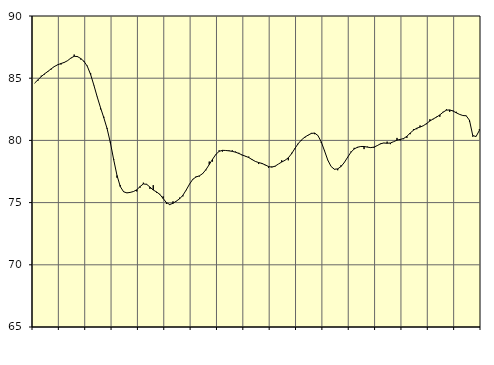
| Category | Piggar | Series 1 |
|---|---|---|
| nan | 84.6 | 84.61 |
| 87.0 | 84.8 | 84.87 |
| 87.0 | 85.2 | 85.13 |
| 87.0 | 85.3 | 85.35 |
| nan | 85.5 | 85.54 |
| 88.0 | 85.7 | 85.75 |
| 88.0 | 85.9 | 85.94 |
| 88.0 | 86.1 | 86.08 |
| nan | 86.1 | 86.18 |
| 89.0 | 86.3 | 86.27 |
| 89.0 | 86.4 | 86.41 |
| 89.0 | 86.6 | 86.62 |
| nan | 86.9 | 86.76 |
| 90.0 | 86.7 | 86.74 |
| 90.0 | 86.5 | 86.58 |
| 90.0 | 86.3 | 86.35 |
| nan | 86 | 85.95 |
| 91.0 | 85.4 | 85.29 |
| 91.0 | 84.4 | 84.42 |
| 91.0 | 83.5 | 83.49 |
| nan | 82.5 | 82.63 |
| 92.0 | 81.9 | 81.82 |
| 92.0 | 81 | 80.94 |
| 92.0 | 79.9 | 79.8 |
| nan | 78.5 | 78.44 |
| 93.0 | 77 | 77.18 |
| 93.0 | 76.4 | 76.29 |
| 93.0 | 75.9 | 75.87 |
| nan | 75.8 | 75.78 |
| 94.0 | 75.8 | 75.82 |
| 94.0 | 75.9 | 75.89 |
| 94.0 | 75.9 | 76.03 |
| nan | 76.2 | 76.29 |
| 95.0 | 76.6 | 76.5 |
| 95.0 | 76.5 | 76.47 |
| 95.0 | 76.1 | 76.25 |
| nan | 76.4 | 76.01 |
| 96.0 | 75.8 | 75.86 |
| 96.0 | 75.7 | 75.66 |
| 96.0 | 75.5 | 75.33 |
| nan | 74.9 | 75 |
| 97.0 | 74.8 | 74.85 |
| 97.0 | 75.1 | 74.94 |
| 97.0 | 75.1 | 75.12 |
| nan | 75.4 | 75.3 |
| 98.0 | 75.5 | 75.59 |
| 98.0 | 76 | 76.01 |
| 98.0 | 76.5 | 76.48 |
| nan | 76.9 | 76.87 |
| 99.0 | 77.1 | 77.06 |
| 99.0 | 77.1 | 77.15 |
| 99.0 | 77.3 | 77.33 |
| nan | 77.6 | 77.65 |
| 0.0 | 78.3 | 78.06 |
| 0.0 | 78.3 | 78.48 |
| 0.0 | 78.9 | 78.87 |
| nan | 79.2 | 79.12 |
| 1.0 | 79.1 | 79.2 |
| 1.0 | 79.2 | 79.19 |
| 1.0 | 79.2 | 79.16 |
| nan | 79.2 | 79.12 |
| 2.0 | 79.1 | 79.05 |
| 2.0 | 79 | 78.95 |
| 2.0 | 78.8 | 78.83 |
| nan | 78.7 | 78.73 |
| 3.0 | 78.7 | 78.62 |
| 3.0 | 78.5 | 78.46 |
| 3.0 | 78.3 | 78.31 |
| nan | 78.1 | 78.22 |
| 4.0 | 78.1 | 78.15 |
| 4.0 | 78 | 78.03 |
| 4.0 | 77.8 | 77.9 |
| nan | 77.9 | 77.85 |
| 5.0 | 77.9 | 77.93 |
| 5.0 | 78.1 | 78.1 |
| 5.0 | 78.4 | 78.26 |
| nan | 78.4 | 78.4 |
| 6.0 | 78.4 | 78.6 |
| 6.0 | 79 | 78.93 |
| 6.0 | 79.3 | 79.35 |
| nan | 79.7 | 79.74 |
| 7.0 | 80 | 80.04 |
| 7.0 | 80.2 | 80.26 |
| 7.0 | 80.4 | 80.42 |
| nan | 80.6 | 80.56 |
| 8.0 | 80.5 | 80.59 |
| 8.0 | 80.4 | 80.39 |
| 8.0 | 79.8 | 79.88 |
| nan | 79.2 | 79.16 |
| 9.0 | 78.4 | 78.41 |
| 9.0 | 77.9 | 77.9 |
| 9.0 | 77.7 | 77.68 |
| nan | 77.6 | 77.71 |
| 10.0 | 78 | 77.9 |
| 10.0 | 78.2 | 78.22 |
| 10.0 | 78.6 | 78.64 |
| nan | 79.1 | 79.04 |
| 11.0 | 79.4 | 79.31 |
| 11.0 | 79.4 | 79.45 |
| 11.0 | 79.5 | 79.51 |
| nan | 79.3 | 79.51 |
| 12.0 | 79.5 | 79.46 |
| 12.0 | 79.4 | 79.42 |
| 12.0 | 79.4 | 79.46 |
| nan | 79.6 | 79.58 |
| 13.0 | 79.7 | 79.73 |
| 13.0 | 79.8 | 79.79 |
| 13.0 | 79.9 | 79.77 |
| nan | 79.7 | 79.79 |
| 14.0 | 79.9 | 79.9 |
| 14.0 | 80.2 | 80.02 |
| 14.0 | 80 | 80.08 |
| nan | 80.1 | 80.15 |
| 15.0 | 80.2 | 80.33 |
| 15.0 | 80.5 | 80.59 |
| 15.0 | 80.9 | 80.82 |
| nan | 80.9 | 80.98 |
| 16.0 | 81.2 | 81.07 |
| 16.0 | 81.2 | 81.18 |
| 16.0 | 81.3 | 81.36 |
| nan | 81.7 | 81.56 |
| 17.0 | 81.7 | 81.73 |
| 17.0 | 81.9 | 81.87 |
| 17.0 | 81.9 | 82.05 |
| nan | 82.3 | 82.27 |
| 18.0 | 82.5 | 82.43 |
| 18.0 | 82.3 | 82.45 |
| 18.0 | 82.4 | 82.36 |
| nan | 82.3 | 82.22 |
| 19.0 | 82.1 | 82.09 |
| 19.0 | 82 | 82 |
| 19.0 | 82 | 81.98 |
| nan | 81.5 | 81.62 |
| 20.0 | 80.3 | 80.39 |
| 20.0 | 80.3 | 80.31 |
| 20.0 | 80.9 | 80.8 |